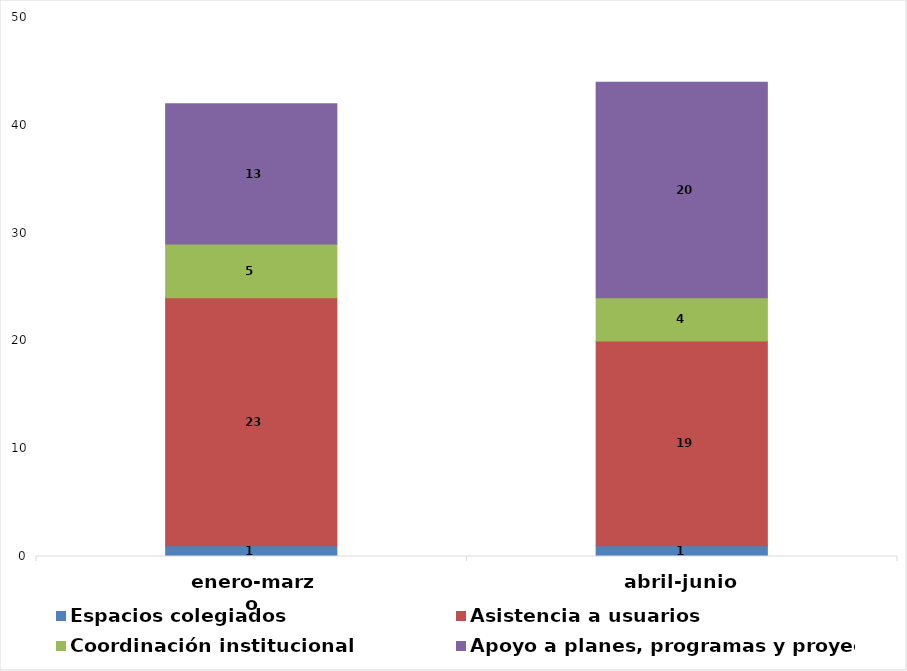
| Category | Espacios colegiados | Asistencia a usuarios  | Coordinación institucional  | Apoyo a planes, programas y proyectos |
|---|---|---|---|---|
| enero-marzo | 1 | 23 | 5 | 13 |
| abril-junio | 1 | 19 | 4 | 20 |